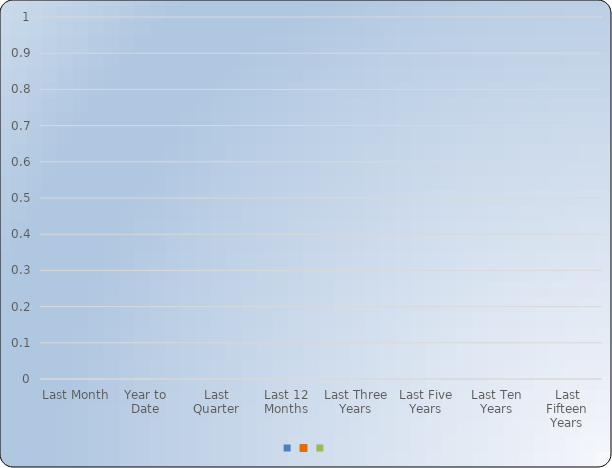
| Category | Series 0 | Series 1 | Series 2 |
|---|---|---|---|
| Last Month | 0 |  |  |
| Year to Date | 0 |  |  |
| Last Quarter | 0 |  |  |
| Last 12 Months | 0 |  |  |
| Last Three Years | 0 |  |  |
| Last Five Years | 0 |  |  |
| Last Ten Years | 0 |  |  |
| Last Fifteen Years | 0 |  |  |